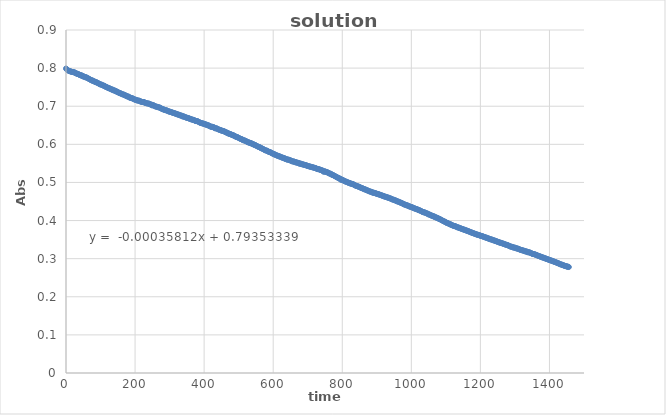
| Category | Series 0 |
|---|---|
| 0.0 | 0.799 |
| 2.0 | 0.797 |
| 4.0 | 0.795 |
| 6.0 | 0.794 |
| 8.0 | 0.793 |
| 10.0 | 0.792 |
| 12.0 | 0.792 |
| 14.0 | 0.791 |
| 16.0 | 0.79 |
| 18.0 | 0.79 |
| 20.0 | 0.79 |
| 22.0 | 0.789 |
| 24.0 | 0.789 |
| 26.0 | 0.788 |
| 28.0 | 0.787 |
| 30.0 | 0.786 |
| 32.0 | 0.785 |
| 34.0 | 0.785 |
| 36.0 | 0.784 |
| 38.0 | 0.783 |
| 40.0 | 0.782 |
| 42.0 | 0.782 |
| 44.0 | 0.78 |
| 46.0 | 0.781 |
| 48.0 | 0.779 |
| 50.0 | 0.778 |
| 52.0 | 0.778 |
| 54.0 | 0.777 |
| 56.0 | 0.776 |
| 58.0 | 0.776 |
| 60.0 | 0.775 |
| 62.0 | 0.774 |
| 64.0 | 0.773 |
| 66.0 | 0.772 |
| 68.0 | 0.771 |
| 70.0 | 0.77 |
| 72.0 | 0.769 |
| 74.0 | 0.768 |
| 76.0 | 0.768 |
| 78.0 | 0.766 |
| 80.0 | 0.766 |
| 82.0 | 0.765 |
| 84.0 | 0.764 |
| 86.0 | 0.763 |
| 88.0 | 0.763 |
| 90.0 | 0.762 |
| 92.0 | 0.761 |
| 94.0 | 0.76 |
| 96.0 | 0.759 |
| 98.0 | 0.758 |
| 100.0 | 0.757 |
| 102.0 | 0.757 |
| 104.0 | 0.756 |
| 106.0 | 0.755 |
| 108.0 | 0.754 |
| 110.0 | 0.754 |
| 112.0 | 0.753 |
| 114.0 | 0.751 |
| 116.0 | 0.751 |
| 118.0 | 0.75 |
| 120.0 | 0.749 |
| 122.0 | 0.748 |
| 124.0 | 0.747 |
| 126.0 | 0.747 |
| 128.0 | 0.746 |
| 130.0 | 0.745 |
| 132.0 | 0.744 |
| 134.0 | 0.744 |
| 136.0 | 0.742 |
| 138.0 | 0.742 |
| 140.0 | 0.741 |
| 142.0 | 0.741 |
| 144.0 | 0.739 |
| 146.0 | 0.739 |
| 148.0 | 0.738 |
| 150.0 | 0.737 |
| 152.0 | 0.736 |
| 154.0 | 0.735 |
| 156.0 | 0.734 |
| 158.0 | 0.734 |
| 160.0 | 0.733 |
| 162.0 | 0.732 |
| 164.0 | 0.731 |
| 166.0 | 0.731 |
| 168.0 | 0.73 |
| 170.0 | 0.729 |
| 172.0 | 0.728 |
| 174.0 | 0.728 |
| 176.0 | 0.726 |
| 178.0 | 0.726 |
| 180.0 | 0.725 |
| 182.0 | 0.725 |
| 184.0 | 0.723 |
| 186.0 | 0.722 |
| 188.0 | 0.722 |
| 190.0 | 0.721 |
| 192.0 | 0.721 |
| 194.0 | 0.72 |
| 196.0 | 0.719 |
| 198.0 | 0.718 |
| 200.0 | 0.717 |
| 202.0 | 0.717 |
| 204.0 | 0.716 |
| 206.0 | 0.715 |
| 208.0 | 0.715 |
| 210.0 | 0.715 |
| 212.0 | 0.714 |
| 214.0 | 0.714 |
| 216.0 | 0.712 |
| 218.0 | 0.712 |
| 220.0 | 0.711 |
| 222.0 | 0.711 |
| 224.0 | 0.711 |
| 226.0 | 0.711 |
| 228.0 | 0.709 |
| 230.0 | 0.709 |
| 232.0 | 0.708 |
| 234.0 | 0.708 |
| 236.0 | 0.707 |
| 238.0 | 0.707 |
| 240.0 | 0.707 |
| 242.0 | 0.706 |
| 244.0 | 0.705 |
| 246.0 | 0.704 |
| 248.0 | 0.704 |
| 250.0 | 0.702 |
| 252.0 | 0.703 |
| 254.0 | 0.702 |
| 256.0 | 0.701 |
| 258.0 | 0.7 |
| 260.0 | 0.699 |
| 262.0 | 0.699 |
| 264.0 | 0.698 |
| 266.0 | 0.698 |
| 268.0 | 0.697 |
| 270.0 | 0.697 |
| 272.0 | 0.696 |
| 274.0 | 0.695 |
| 276.0 | 0.694 |
| 278.0 | 0.693 |
| 280.0 | 0.692 |
| 282.0 | 0.692 |
| 284.0 | 0.691 |
| 286.0 | 0.69 |
| 288.0 | 0.69 |
| 290.0 | 0.689 |
| 292.0 | 0.689 |
| 294.0 | 0.688 |
| 296.0 | 0.687 |
| 298.0 | 0.686 |
| 300.0 | 0.686 |
| 302.0 | 0.685 |
| 304.0 | 0.685 |
| 306.0 | 0.684 |
| 308.0 | 0.683 |
| 310.0 | 0.683 |
| 312.0 | 0.682 |
| 314.0 | 0.682 |
| 316.0 | 0.681 |
| 318.0 | 0.68 |
| 320.0 | 0.68 |
| 322.0 | 0.679 |
| 324.0 | 0.678 |
| 326.0 | 0.678 |
| 328.0 | 0.677 |
| 330.0 | 0.676 |
| 332.0 | 0.676 |
| 334.0 | 0.675 |
| 336.0 | 0.675 |
| 338.0 | 0.673 |
| 340.0 | 0.673 |
| 342.0 | 0.673 |
| 344.0 | 0.672 |
| 346.0 | 0.671 |
| 348.0 | 0.67 |
| 350.0 | 0.67 |
| 352.0 | 0.669 |
| 354.0 | 0.669 |
| 356.0 | 0.668 |
| 358.0 | 0.667 |
| 360.0 | 0.667 |
| 362.0 | 0.666 |
| 364.0 | 0.665 |
| 366.0 | 0.665 |
| 368.0 | 0.664 |
| 370.0 | 0.664 |
| 372.0 | 0.663 |
| 374.0 | 0.662 |
| 376.0 | 0.661 |
| 378.0 | 0.661 |
| 380.0 | 0.661 |
| 382.0 | 0.66 |
| 384.0 | 0.659 |
| 386.0 | 0.658 |
| 388.0 | 0.657 |
| 390.0 | 0.656 |
| 392.0 | 0.656 |
| 394.0 | 0.655 |
| 396.0 | 0.655 |
| 398.0 | 0.654 |
| 400.0 | 0.654 |
| 402.0 | 0.653 |
| 404.0 | 0.652 |
| 406.0 | 0.652 |
| 408.0 | 0.651 |
| 410.0 | 0.65 |
| 412.0 | 0.65 |
| 414.0 | 0.649 |
| 416.0 | 0.648 |
| 418.0 | 0.647 |
| 420.0 | 0.646 |
| 422.0 | 0.646 |
| 424.0 | 0.646 |
| 426.0 | 0.645 |
| 428.0 | 0.645 |
| 430.0 | 0.643 |
| 432.0 | 0.642 |
| 434.0 | 0.642 |
| 436.0 | 0.642 |
| 438.0 | 0.641 |
| 440.0 | 0.64 |
| 442.0 | 0.639 |
| 444.0 | 0.638 |
| 446.0 | 0.638 |
| 448.0 | 0.637 |
| 450.0 | 0.636 |
| 452.0 | 0.636 |
| 454.0 | 0.635 |
| 456.0 | 0.635 |
| 458.0 | 0.634 |
| 460.0 | 0.633 |
| 462.0 | 0.632 |
| 464.0 | 0.631 |
| 466.0 | 0.631 |
| 468.0 | 0.629 |
| 470.0 | 0.629 |
| 472.0 | 0.628 |
| 474.0 | 0.627 |
| 476.0 | 0.627 |
| 478.0 | 0.626 |
| 480.0 | 0.625 |
| 482.0 | 0.624 |
| 484.0 | 0.624 |
| 486.0 | 0.623 |
| 488.0 | 0.622 |
| 490.0 | 0.621 |
| 492.0 | 0.62 |
| 494.0 | 0.619 |
| 496.0 | 0.619 |
| 498.0 | 0.618 |
| 500.0 | 0.617 |
| 502.0 | 0.616 |
| 504.0 | 0.615 |
| 506.0 | 0.614 |
| 508.0 | 0.614 |
| 510.0 | 0.613 |
| 512.0 | 0.611 |
| 514.0 | 0.611 |
| 516.0 | 0.61 |
| 518.0 | 0.61 |
| 520.0 | 0.609 |
| 522.0 | 0.608 |
| 524.0 | 0.607 |
| 526.0 | 0.606 |
| 528.0 | 0.605 |
| 530.0 | 0.605 |
| 532.0 | 0.604 |
| 534.0 | 0.603 |
| 536.0 | 0.603 |
| 538.0 | 0.602 |
| 540.0 | 0.601 |
| 542.0 | 0.6 |
| 544.0 | 0.6 |
| 546.0 | 0.598 |
| 548.0 | 0.598 |
| 550.0 | 0.597 |
| 552.0 | 0.596 |
| 554.0 | 0.595 |
| 556.0 | 0.594 |
| 558.0 | 0.593 |
| 560.0 | 0.593 |
| 562.0 | 0.592 |
| 564.0 | 0.59 |
| 566.0 | 0.59 |
| 568.0 | 0.589 |
| 570.0 | 0.588 |
| 572.0 | 0.587 |
| 574.0 | 0.586 |
| 576.0 | 0.585 |
| 578.0 | 0.584 |
| 580.0 | 0.584 |
| 582.0 | 0.583 |
| 584.0 | 0.582 |
| 586.0 | 0.581 |
| 588.0 | 0.58 |
| 590.0 | 0.58 |
| 592.0 | 0.579 |
| 594.0 | 0.578 |
| 596.0 | 0.577 |
| 598.0 | 0.576 |
| 600.0 | 0.575 |
| 602.0 | 0.575 |
| 604.0 | 0.573 |
| 606.0 | 0.573 |
| 608.0 | 0.572 |
| 610.0 | 0.571 |
| 612.0 | 0.57 |
| 614.0 | 0.57 |
| 616.0 | 0.569 |
| 618.0 | 0.568 |
| 620.0 | 0.568 |
| 622.0 | 0.567 |
| 624.0 | 0.566 |
| 626.0 | 0.565 |
| 628.0 | 0.565 |
| 630.0 | 0.564 |
| 632.0 | 0.564 |
| 634.0 | 0.562 |
| 636.0 | 0.562 |
| 638.0 | 0.561 |
| 640.0 | 0.56 |
| 642.0 | 0.56 |
| 644.0 | 0.56 |
| 646.0 | 0.559 |
| 648.0 | 0.558 |
| 650.0 | 0.558 |
| 652.0 | 0.557 |
| 654.0 | 0.556 |
| 656.0 | 0.555 |
| 658.0 | 0.555 |
| 660.0 | 0.555 |
| 662.0 | 0.554 |
| 664.0 | 0.553 |
| 666.0 | 0.553 |
| 668.0 | 0.552 |
| 670.0 | 0.552 |
| 672.0 | 0.551 |
| 674.0 | 0.551 |
| 676.0 | 0.549 |
| 678.0 | 0.55 |
| 680.0 | 0.549 |
| 682.0 | 0.548 |
| 684.0 | 0.548 |
| 686.0 | 0.547 |
| 688.0 | 0.547 |
| 690.0 | 0.546 |
| 692.0 | 0.546 |
| 694.0 | 0.545 |
| 696.0 | 0.545 |
| 698.0 | 0.544 |
| 700.0 | 0.543 |
| 702.0 | 0.543 |
| 704.0 | 0.542 |
| 706.0 | 0.542 |
| 708.0 | 0.541 |
| 710.0 | 0.541 |
| 712.0 | 0.54 |
| 714.0 | 0.54 |
| 716.0 | 0.539 |
| 718.0 | 0.539 |
| 720.0 | 0.538 |
| 722.0 | 0.538 |
| 724.0 | 0.537 |
| 726.0 | 0.536 |
| 728.0 | 0.535 |
| 730.0 | 0.535 |
| 732.0 | 0.535 |
| 734.0 | 0.534 |
| 736.0 | 0.533 |
| 738.0 | 0.533 |
| 740.0 | 0.532 |
| 742.0 | 0.531 |
| 744.0 | 0.531 |
| 746.0 | 0.528 |
| 748.0 | 0.529 |
| 750.0 | 0.529 |
| 752.0 | 0.528 |
| 754.0 | 0.527 |
| 756.0 | 0.527 |
| 758.0 | 0.526 |
| 760.0 | 0.525 |
| 762.0 | 0.524 |
| 764.0 | 0.523 |
| 766.0 | 0.523 |
| 768.0 | 0.522 |
| 770.0 | 0.52 |
| 772.0 | 0.52 |
| 774.0 | 0.519 |
| 776.0 | 0.518 |
| 778.0 | 0.517 |
| 780.0 | 0.516 |
| 782.0 | 0.515 |
| 784.0 | 0.514 |
| 786.0 | 0.513 |
| 788.0 | 0.512 |
| 790.0 | 0.511 |
| 792.0 | 0.51 |
| 794.0 | 0.51 |
| 796.0 | 0.507 |
| 798.0 | 0.508 |
| 800.0 | 0.506 |
| 802.0 | 0.506 |
| 804.0 | 0.505 |
| 806.0 | 0.504 |
| 808.0 | 0.503 |
| 810.0 | 0.502 |
| 812.0 | 0.502 |
| 814.0 | 0.501 |
| 816.0 | 0.5 |
| 818.0 | 0.499 |
| 820.0 | 0.499 |
| 822.0 | 0.498 |
| 824.0 | 0.497 |
| 826.0 | 0.497 |
| 828.0 | 0.496 |
| 830.0 | 0.496 |
| 832.0 | 0.495 |
| 834.0 | 0.494 |
| 836.0 | 0.493 |
| 838.0 | 0.492 |
| 840.0 | 0.491 |
| 842.0 | 0.491 |
| 844.0 | 0.49 |
| 846.0 | 0.489 |
| 848.0 | 0.489 |
| 850.0 | 0.488 |
| 852.0 | 0.487 |
| 854.0 | 0.486 |
| 856.0 | 0.485 |
| 858.0 | 0.485 |
| 860.0 | 0.484 |
| 862.0 | 0.483 |
| 864.0 | 0.482 |
| 866.0 | 0.482 |
| 868.0 | 0.481 |
| 870.0 | 0.48 |
| 872.0 | 0.479 |
| 874.0 | 0.479 |
| 876.0 | 0.478 |
| 878.0 | 0.477 |
| 880.0 | 0.476 |
| 882.0 | 0.476 |
| 884.0 | 0.475 |
| 886.0 | 0.475 |
| 888.0 | 0.473 |
| 890.0 | 0.473 |
| 892.0 | 0.473 |
| 894.0 | 0.472 |
| 896.0 | 0.472 |
| 898.0 | 0.471 |
| 900.0 | 0.47 |
| 902.0 | 0.47 |
| 904.0 | 0.469 |
| 906.0 | 0.469 |
| 908.0 | 0.468 |
| 910.0 | 0.467 |
| 912.0 | 0.467 |
| 914.0 | 0.466 |
| 916.0 | 0.465 |
| 918.0 | 0.465 |
| 920.0 | 0.464 |
| 922.0 | 0.463 |
| 924.0 | 0.463 |
| 926.0 | 0.462 |
| 928.0 | 0.462 |
| 930.0 | 0.461 |
| 932.0 | 0.46 |
| 934.0 | 0.46 |
| 936.0 | 0.459 |
| 938.0 | 0.458 |
| 940.0 | 0.458 |
| 942.0 | 0.457 |
| 944.0 | 0.456 |
| 946.0 | 0.455 |
| 948.0 | 0.455 |
| 950.0 | 0.454 |
| 952.0 | 0.453 |
| 954.0 | 0.453 |
| 956.0 | 0.452 |
| 958.0 | 0.451 |
| 960.0 | 0.45 |
| 962.0 | 0.45 |
| 964.0 | 0.449 |
| 966.0 | 0.448 |
| 968.0 | 0.447 |
| 970.0 | 0.447 |
| 972.0 | 0.446 |
| 974.0 | 0.445 |
| 976.0 | 0.444 |
| 978.0 | 0.443 |
| 980.0 | 0.442 |
| 982.0 | 0.442 |
| 984.0 | 0.441 |
| 986.0 | 0.44 |
| 988.0 | 0.44 |
| 990.0 | 0.439 |
| 992.0 | 0.438 |
| 994.0 | 0.437 |
| 996.0 | 0.437 |
| 998.0 | 0.436 |
| 1000.0 | 0.435 |
| 1002.0 | 0.435 |
| 1004.0 | 0.434 |
| 1006.0 | 0.433 |
| 1008.0 | 0.432 |
| 1010.0 | 0.432 |
| 1012.0 | 0.431 |
| 1014.0 | 0.43 |
| 1016.0 | 0.43 |
| 1018.0 | 0.429 |
| 1020.0 | 0.428 |
| 1022.0 | 0.427 |
| 1024.0 | 0.427 |
| 1026.0 | 0.426 |
| 1028.0 | 0.425 |
| 1030.0 | 0.424 |
| 1032.0 | 0.423 |
| 1034.0 | 0.422 |
| 1036.0 | 0.422 |
| 1038.0 | 0.421 |
| 1040.0 | 0.421 |
| 1042.0 | 0.42 |
| 1044.0 | 0.419 |
| 1046.0 | 0.418 |
| 1048.0 | 0.418 |
| 1050.0 | 0.416 |
| 1052.0 | 0.416 |
| 1054.0 | 0.415 |
| 1056.0 | 0.414 |
| 1058.0 | 0.413 |
| 1060.0 | 0.413 |
| 1062.0 | 0.412 |
| 1064.0 | 0.411 |
| 1066.0 | 0.411 |
| 1068.0 | 0.409 |
| 1070.0 | 0.409 |
| 1072.0 | 0.408 |
| 1074.0 | 0.407 |
| 1076.0 | 0.407 |
| 1078.0 | 0.405 |
| 1080.0 | 0.405 |
| 1082.0 | 0.404 |
| 1084.0 | 0.403 |
| 1086.0 | 0.402 |
| 1088.0 | 0.401 |
| 1090.0 | 0.4 |
| 1092.0 | 0.399 |
| 1094.0 | 0.398 |
| 1096.0 | 0.397 |
| 1098.0 | 0.397 |
| 1100.0 | 0.395 |
| 1102.0 | 0.394 |
| 1104.0 | 0.394 |
| 1106.0 | 0.393 |
| 1108.0 | 0.392 |
| 1110.0 | 0.391 |
| 1112.0 | 0.391 |
| 1114.0 | 0.389 |
| 1116.0 | 0.389 |
| 1118.0 | 0.388 |
| 1120.0 | 0.387 |
| 1122.0 | 0.386 |
| 1124.0 | 0.386 |
| 1126.0 | 0.385 |
| 1128.0 | 0.385 |
| 1130.0 | 0.384 |
| 1132.0 | 0.383 |
| 1134.0 | 0.382 |
| 1136.0 | 0.382 |
| 1138.0 | 0.381 |
| 1140.0 | 0.38 |
| 1142.0 | 0.38 |
| 1144.0 | 0.379 |
| 1146.0 | 0.378 |
| 1148.0 | 0.378 |
| 1150.0 | 0.377 |
| 1152.0 | 0.376 |
| 1154.0 | 0.376 |
| 1156.0 | 0.375 |
| 1158.0 | 0.374 |
| 1160.0 | 0.374 |
| 1162.0 | 0.373 |
| 1164.0 | 0.372 |
| 1166.0 | 0.372 |
| 1168.0 | 0.371 |
| 1170.0 | 0.37 |
| 1172.0 | 0.369 |
| 1174.0 | 0.369 |
| 1176.0 | 0.368 |
| 1178.0 | 0.367 |
| 1180.0 | 0.367 |
| 1182.0 | 0.366 |
| 1184.0 | 0.365 |
| 1186.0 | 0.365 |
| 1188.0 | 0.364 |
| 1190.0 | 0.363 |
| 1192.0 | 0.363 |
| 1194.0 | 0.362 |
| 1196.0 | 0.362 |
| 1198.0 | 0.361 |
| 1200.0 | 0.36 |
| 1202.0 | 0.36 |
| 1204.0 | 0.359 |
| 1206.0 | 0.359 |
| 1208.0 | 0.358 |
| 1210.0 | 0.357 |
| 1212.0 | 0.357 |
| 1214.0 | 0.356 |
| 1216.0 | 0.355 |
| 1218.0 | 0.355 |
| 1220.0 | 0.354 |
| 1222.0 | 0.353 |
| 1224.0 | 0.353 |
| 1226.0 | 0.352 |
| 1228.0 | 0.351 |
| 1230.0 | 0.351 |
| 1232.0 | 0.35 |
| 1234.0 | 0.35 |
| 1236.0 | 0.349 |
| 1238.0 | 0.348 |
| 1240.0 | 0.348 |
| 1242.0 | 0.347 |
| 1244.0 | 0.346 |
| 1246.0 | 0.346 |
| 1248.0 | 0.345 |
| 1250.0 | 0.344 |
| 1252.0 | 0.344 |
| 1254.0 | 0.343 |
| 1256.0 | 0.342 |
| 1258.0 | 0.342 |
| 1260.0 | 0.341 |
| 1262.0 | 0.341 |
| 1264.0 | 0.34 |
| 1266.0 | 0.339 |
| 1268.0 | 0.339 |
| 1270.0 | 0.338 |
| 1272.0 | 0.337 |
| 1274.0 | 0.337 |
| 1276.0 | 0.336 |
| 1278.0 | 0.336 |
| 1280.0 | 0.335 |
| 1282.0 | 0.334 |
| 1284.0 | 0.333 |
| 1286.0 | 0.332 |
| 1288.0 | 0.332 |
| 1290.0 | 0.331 |
| 1292.0 | 0.331 |
| 1294.0 | 0.33 |
| 1296.0 | 0.329 |
| 1298.0 | 0.329 |
| 1300.0 | 0.329 |
| 1302.0 | 0.328 |
| 1304.0 | 0.327 |
| 1306.0 | 0.327 |
| 1308.0 | 0.326 |
| 1310.0 | 0.326 |
| 1312.0 | 0.325 |
| 1314.0 | 0.324 |
| 1316.0 | 0.323 |
| 1318.0 | 0.323 |
| 1320.0 | 0.322 |
| 1322.0 | 0.322 |
| 1324.0 | 0.321 |
| 1326.0 | 0.321 |
| 1328.0 | 0.32 |
| 1330.0 | 0.319 |
| 1332.0 | 0.319 |
| 1334.0 | 0.319 |
| 1336.0 | 0.317 |
| 1338.0 | 0.317 |
| 1340.0 | 0.317 |
| 1342.0 | 0.316 |
| 1344.0 | 0.316 |
| 1346.0 | 0.315 |
| 1348.0 | 0.314 |
| 1350.0 | 0.313 |
| 1352.0 | 0.312 |
| 1354.0 | 0.312 |
| 1356.0 | 0.312 |
| 1358.0 | 0.311 |
| 1360.0 | 0.31 |
| 1362.0 | 0.31 |
| 1364.0 | 0.309 |
| 1366.0 | 0.308 |
| 1368.0 | 0.307 |
| 1370.0 | 0.307 |
| 1372.0 | 0.306 |
| 1374.0 | 0.305 |
| 1376.0 | 0.305 |
| 1378.0 | 0.304 |
| 1380.0 | 0.303 |
| 1382.0 | 0.303 |
| 1384.0 | 0.302 |
| 1386.0 | 0.301 |
| 1388.0 | 0.301 |
| 1390.0 | 0.3 |
| 1392.0 | 0.299 |
| 1394.0 | 0.299 |
| 1396.0 | 0.298 |
| 1398.0 | 0.297 |
| 1400.0 | 0.297 |
| 1402.0 | 0.296 |
| 1404.0 | 0.295 |
| 1406.0 | 0.295 |
| 1408.0 | 0.294 |
| 1410.0 | 0.293 |
| 1412.0 | 0.293 |
| 1414.0 | 0.292 |
| 1416.0 | 0.291 |
| 1418.0 | 0.291 |
| 1420.0 | 0.29 |
| 1422.0 | 0.289 |
| 1424.0 | 0.288 |
| 1426.0 | 0.288 |
| 1428.0 | 0.287 |
| 1430.0 | 0.286 |
| 1432.0 | 0.285 |
| 1434.0 | 0.285 |
| 1436.0 | 0.284 |
| 1438.0 | 0.283 |
| 1440.0 | 0.283 |
| 1442.0 | 0.282 |
| 1444.0 | 0.281 |
| 1446.0 | 0.281 |
| 1448.0 | 0.28 |
| 1450.0 | 0.28 |
| 1452.0 | 0.279 |
| 1454.0 | 0.279 |
| 1456.0 | 0.278 |